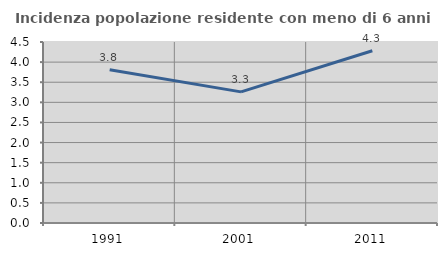
| Category | Incidenza popolazione residente con meno di 6 anni |
|---|---|
| 1991.0 | 3.809 |
| 2001.0 | 3.26 |
| 2011.0 | 4.283 |